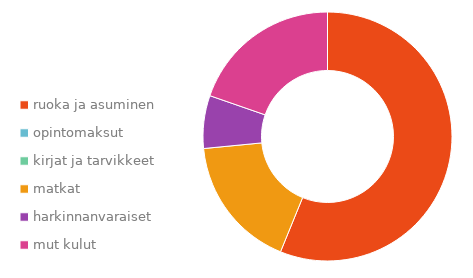
| Category | Series 0 |
|---|---|
| ruoka ja asuminen | 0.253 |
| opintomaksut | 0.336 |
| kirjat ja tarvikkeet | 0.146 |
| matkat | 0.078 |
| harkinnanvaraiset | 0.076 |
| mut kulut | 0.112 |